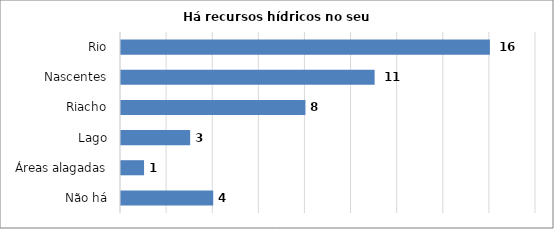
| Category | Series 0 |
|---|---|
| Não há | 4 |
| Áreas alagadas | 1 |
| Lago | 3 |
| Riacho | 8 |
| Nascentes | 11 |
| Rio | 16 |